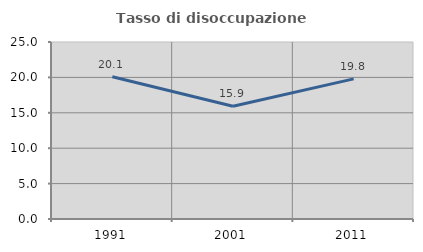
| Category | Tasso di disoccupazione giovanile  |
|---|---|
| 1991.0 | 20.084 |
| 2001.0 | 15.929 |
| 2011.0 | 19.792 |